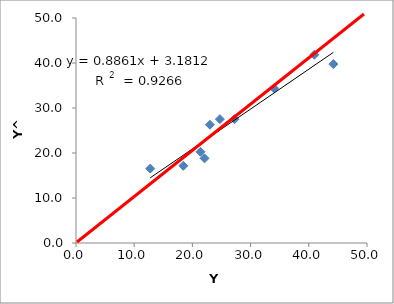
| Category | Series 0 |
|---|---|
| 18.44611176646319 | 17.155 |
| 21.387377532623336 | 20.266 |
| 23.017592955052315 | 26.28 |
| 27.242393971131232 | 27.525 |
| 34.037947401089326 | 34.369 |
| 44.218517454987875 | 39.761 |
| 40.95506071058158 | 41.835 |
| 12.75325970879093 | 16.533 |
| 22.089400299496297 | 18.814 |
| 24.719198322979373 | 27.525 |